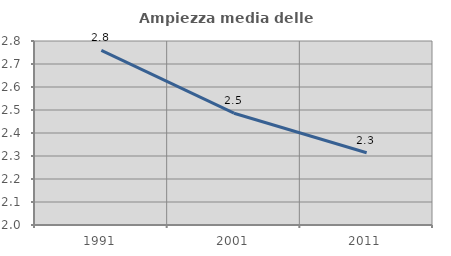
| Category | Ampiezza media delle famiglie |
|---|---|
| 1991.0 | 2.759 |
| 2001.0 | 2.486 |
| 2011.0 | 2.314 |